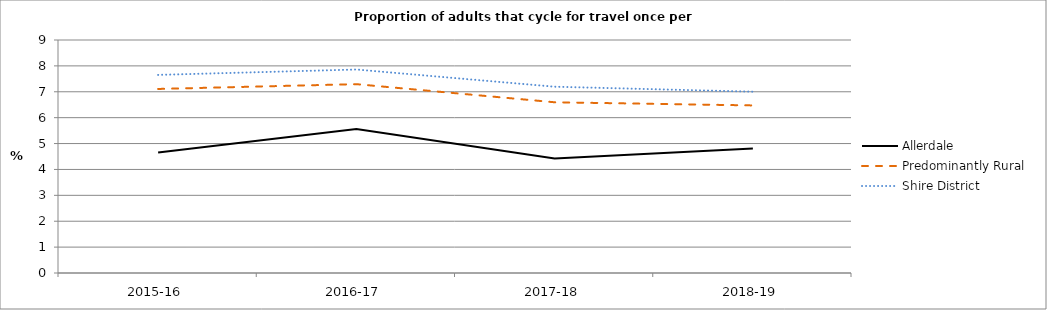
| Category | Allerdale | Predominantly Rural | Shire District |
|---|---|---|---|
| 2015-16 | 4.655 | 7.109 | 7.652 |
| 2016-17 | 5.562 | 7.294 | 7.859 |
| 2017-18 | 4.427 | 6.595 | 7.195 |
| 2018-19 | 4.808 | 6.473 | 7.004 |